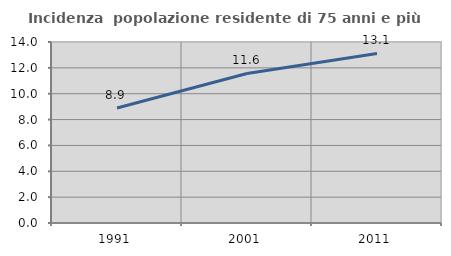
| Category | Incidenza  popolazione residente di 75 anni e più |
|---|---|
| 1991.0 | 8.9 |
| 2001.0 | 11.569 |
| 2011.0 | 13.112 |